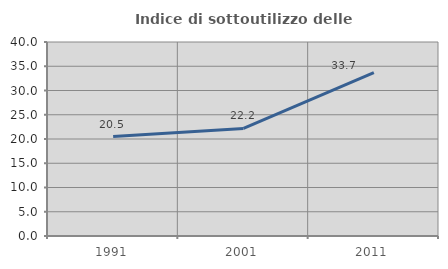
| Category | Indice di sottoutilizzo delle abitazioni  |
|---|---|
| 1991.0 | 20.493 |
| 2001.0 | 22.169 |
| 2011.0 | 33.705 |